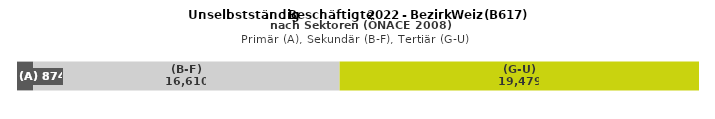
| Category | (A) | (B-F) | (G-U) |
|---|---|---|---|
| 0 | 874 | 16610 | 19479 |